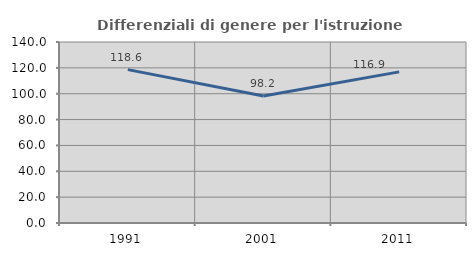
| Category | Differenziali di genere per l'istruzione superiore |
|---|---|
| 1991.0 | 118.627 |
| 2001.0 | 98.186 |
| 2011.0 | 116.886 |